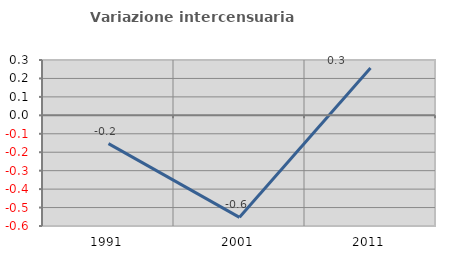
| Category | Variazione intercensuaria annua |
|---|---|
| 1991.0 | -0.154 |
| 2001.0 | -0.553 |
| 2011.0 | 0.257 |